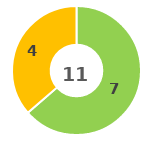
| Category | Series 0 |
|---|---|
| 0 | 0 |
| 1 | 7 |
| 2 | 4 |
| 3 | 0 |
| 4 | 0 |